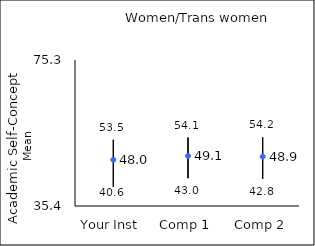
| Category | 25th percentile | 75th percentile | Mean |
|---|---|---|---|
| Your Inst | 40.6 | 53.5 | 48.03 |
| Comp 1 | 43 | 54.1 | 49.08 |
| Comp 2 | 42.8 | 54.2 | 48.92 |